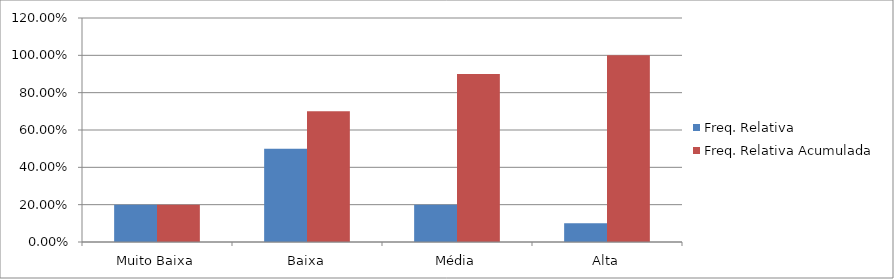
| Category | Freq. Relativa | Freq. Relativa Acumulada |
|---|---|---|
| Muito Baixa | 0.2 | 0.2 |
| Baixa | 0.5 | 0.7 |
| Média | 0.2 | 0.9 |
| Alta | 0.1 | 1 |